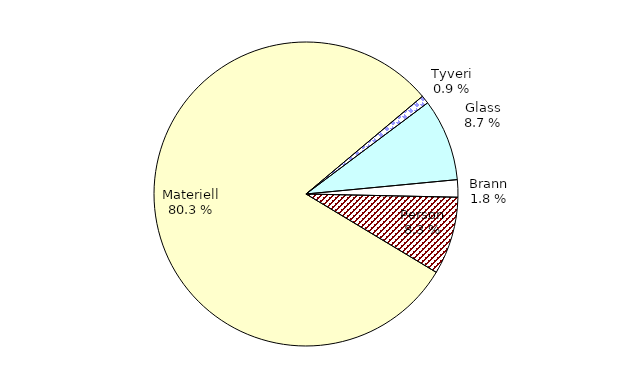
| Category | Series 0 |
|---|---|
| Tyveri | 71.759 |
| Glass | 715.64 |
| Brann | 151.687 |
| Person | 678.805 |
| Materiell | 6582.983 |